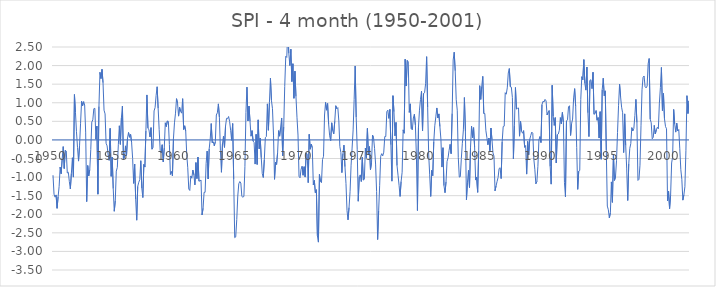
| Category | SPI - 4 month |
|---|---|
| 1950.0 | -0.95 |
| nan | -1.46 |
| nan | -1.54 |
| nan | -1.48 |
| nan | -1.84 |
| nan | -1.53 |
| nan | -1.25 |
| nan | -0.73 |
| nan | -0.91 |
| nan | -0.51 |
| nan | -0.18 |
| nan | -0.77 |
| nan | -0.28 |
| nan | -0.3 |
| nan | -0.89 |
| nan | -0.87 |
| nan | -1.12 |
| nan | -1.32 |
| nan | -0.9 |
| nan | -0.48 |
| nan | -1 |
| nan | 1.22 |
| nan | 0.74 |
| nan | 0.22 |
| nan | -0.2 |
| nan | -0.57 |
| nan | -0.16 |
| nan | 0.45 |
| nan | 1.04 |
| nan | 0.92 |
| nan | 1.03 |
| nan | 0.94 |
| nan | 0.21 |
| nan | -1.66 |
| nan | -0.69 |
| nan | -0.97 |
| nan | -0.8 |
| nan | -0.26 |
| nan | 0.48 |
| nan | 0.54 |
| nan | 0.84 |
| nan | 0.85 |
| nan | 0.02 |
| nan | 0.37 |
| nan | -1.46 |
| nan | 0.9 |
| nan | 1.82 |
| nan | 1.65 |
| nan | 1.9 |
| nan | 1.54 |
| nan | 0.8 |
| nan | 0.7 |
| nan | -0.09 |
| nan | -0.16 |
| nan | -0.4 |
| nan | -0.55 |
| nan | 0.31 |
| nan | -0.98 |
| nan | -0.46 |
| nan | -1.31 |
| 1955.0 | -1.92 |
| nan | -1.64 |
| nan | -0.84 |
| nan | -0.74 |
| nan | -0.13 |
| nan | 0.38 |
| nan | -0.12 |
| nan | 0.59 |
| nan | 0.91 |
| nan | -0.52 |
| nan | -0.46 |
| nan | -0.16 |
| nan | -0.42 |
| nan | 0.05 |
| nan | 0.2 |
| nan | 0.07 |
| nan | 0.15 |
| nan | -0.07 |
| nan | -0.5 |
| nan | -1.17 |
| nan | -0.65 |
| nan | -1.6 |
| nan | -2.16 |
| nan | -1.25 |
| nan | -1.14 |
| nan | -1.07 |
| nan | -0.56 |
| nan | -1.3 |
| nan | -1.55 |
| nan | -0.66 |
| nan | -0.73 |
| nan | 0.24 |
| nan | 1.21 |
| nan | 0.32 |
| nan | 0.27 |
| nan | 0.08 |
| nan | 0.33 |
| nan | -0.25 |
| nan | -0.2 |
| nan | 0.78 |
| nan | 0.87 |
| nan | 1.19 |
| nan | 1.43 |
| nan | 0.85 |
| nan | 0.28 |
| nan | -0.28 |
| nan | -0.35 |
| nan | -0.13 |
| nan | -0.59 |
| nan | -0.22 |
| nan | 0.46 |
| nan | 0.36 |
| nan | 0.51 |
| nan | 0.5 |
| nan | -0.12 |
| nan | -0.93 |
| nan | -0.85 |
| nan | -0.97 |
| nan | 0.04 |
| nan | 0.46 |
| 1960.0 | 0.72 |
| nan | 1.11 |
| nan | 0.99 |
| nan | 0.64 |
| nan | 0.88 |
| nan | 0.77 |
| nan | 0.72 |
| nan | 1.11 |
| nan | 0.28 |
| nan | 0.38 |
| nan | 0.24 |
| nan | -0.39 |
| nan | -0.75 |
| nan | -1.32 |
| nan | -1.36 |
| nan | -0.97 |
| nan | -1.03 |
| nan | -0.81 |
| nan | -0.94 |
| nan | -1.21 |
| nan | -0.61 |
| nan | -1.04 |
| nan | -0.46 |
| nan | -1.11 |
| nan | -1.1 |
| nan | -1.08 |
| nan | -2.02 |
| nan | -1.84 |
| nan | -1.41 |
| nan | -1.41 |
| nan | -0.63 |
| nan | -0.3 |
| nan | -1.05 |
| nan | -0.24 |
| nan | 0.02 |
| nan | 0.44 |
| nan | -0.08 |
| nan | -0.05 |
| nan | -0.16 |
| nan | -0.05 |
| nan | 0.67 |
| nan | 0.73 |
| nan | 0.97 |
| nan | 0.61 |
| nan | -0.28 |
| nan | -0.87 |
| nan | -0.11 |
| nan | 0.1 |
| nan | -0.2 |
| nan | 0.37 |
| nan | 0.58 |
| nan | 0.57 |
| nan | 0.63 |
| nan | 0.5 |
| nan | 0.26 |
| nan | -0.01 |
| nan | 0.44 |
| nan | -1.05 |
| nan | -2.63 |
| nan | -2.61 |
| 1965.0 | -2.14 |
| nan | -1.51 |
| nan | -1.18 |
| nan | -1.12 |
| nan | -1.16 |
| nan | -1.52 |
| nan | -1.54 |
| nan | -1.52 |
| nan | -0.72 |
| nan | 0.74 |
| nan | 1.42 |
| nan | 0.51 |
| nan | 0.91 |
| nan | 0.5 |
| nan | 0.1 |
| nan | 0.25 |
| nan | -0.03 |
| nan | -0.07 |
| nan | -0.65 |
| nan | 0.15 |
| nan | -0.66 |
| nan | 0.54 |
| nan | -0.24 |
| nan | 0.05 |
| nan | -0.48 |
| nan | -0.91 |
| nan | -1.01 |
| nan | -0.53 |
| nan | 0.06 |
| nan | 0.09 |
| nan | 0.97 |
| nan | 0.26 |
| nan | 1 |
| nan | 1.66 |
| nan | 1.06 |
| nan | 0.84 |
| nan | 0.13 |
| nan | -1.06 |
| nan | -0.6 |
| nan | -0.66 |
| nan | -0.35 |
| nan | 0.25 |
| nan | 0.1 |
| nan | 0.34 |
| nan | 0.59 |
| nan | -0.43 |
| nan | 0.35 |
| nan | 1.44 |
| nan | 2.25 |
| nan | 2.22 |
| nan | 2.95 |
| nan | 2.33 |
| nan | 2 |
| nan | 2.44 |
| nan | 1.57 |
| nan | 2.05 |
| nan | 1.12 |
| nan | 1.85 |
| nan | 1.17 |
| nan | 0.61 |
| 1970.0 | 0.13 |
| nan | -0.98 |
| nan | -1.02 |
| nan | -0.79 |
| nan | -0.71 |
| nan | -0.95 |
| nan | -0.72 |
| nan | -1 |
| nan | -0.35 |
| nan | -0.38 |
| nan | -1.15 |
| nan | 0.15 |
| nan | -0.25 |
| nan | -0.11 |
| nan | -0.21 |
| nan | -1.21 |
| nan | -1.09 |
| nan | -1.42 |
| nan | -1.34 |
| nan | -2.58 |
| nan | -2.75 |
| nan | -0.93 |
| nan | -1.12 |
| nan | -1.15 |
| nan | -0.53 |
| nan | -0.44 |
| nan | 0.67 |
| nan | 1.01 |
| nan | 0.8 |
| nan | 0.98 |
| nan | 0.43 |
| nan | 0.11 |
| nan | -0.02 |
| nan | 0.46 |
| nan | 0.25 |
| nan | 0.16 |
| nan | 0.5 |
| nan | 0.92 |
| nan | 0.84 |
| nan | 0.87 |
| nan | 0.51 |
| nan | -0.18 |
| nan | -0.34 |
| nan | -0.88 |
| nan | -0.37 |
| nan | -0.14 |
| nan | -0.72 |
| nan | -1.17 |
| nan | -1.9 |
| nan | -2.15 |
| nan | -1.82 |
| nan | -1.39 |
| nan | -0.68 |
| nan | -0.22 |
| nan | 0.27 |
| nan | 1.09 |
| nan | 1.99 |
| nan | 0.61 |
| nan | -0.25 |
| nan | -1.65 |
| 1975.0 | -0.99 |
| nan | -0.94 |
| nan | -1.12 |
| nan | -0.47 |
| nan | -1.08 |
| nan | -1.06 |
| nan | -0.22 |
| nan | -0.48 |
| nan | 0.31 |
| nan | -0.39 |
| nan | -0.18 |
| nan | -0.8 |
| nan | -0.62 |
| nan | 0.13 |
| nan | 0.06 |
| nan | -0.23 |
| nan | -0.65 |
| nan | -1.39 |
| nan | -2.68 |
| nan | -1.91 |
| nan | -1.22 |
| nan | -0.44 |
| nan | -0.37 |
| nan | -0.43 |
| nan | -0.33 |
| nan | 0.09 |
| nan | 0.09 |
| nan | 0.76 |
| nan | 0.8 |
| nan | 0.58 |
| nan | 0.82 |
| nan | -0.13 |
| nan | -1.11 |
| nan | 1.19 |
| nan | 0.76 |
| nan | 0.11 |
| nan | 0.47 |
| nan | -0.69 |
| nan | -0.95 |
| nan | -1.22 |
| nan | -1.52 |
| nan | -1.12 |
| nan | -0.87 |
| nan | 0.27 |
| nan | 0.18 |
| nan | 2.17 |
| nan | 1.45 |
| nan | 2.14 |
| nan | 2.1 |
| nan | 0.74 |
| nan | 0.97 |
| nan | 0.3 |
| nan | 0.27 |
| nan | 0.59 |
| nan | 0.69 |
| nan | 0.4 |
| nan | -0.45 |
| nan | -1.9 |
| nan | 0.34 |
| nan | 0.8 |
| 1980.0 | 1.09 |
| nan | 1.31 |
| nan | 0.24 |
| nan | 1.25 |
| nan | 1.27 |
| nan | 1.51 |
| nan | 2.24 |
| nan | 0.88 |
| nan | -0.38 |
| nan | -0.94 |
| nan | -1.52 |
| nan | -0.82 |
| nan | -0.96 |
| nan | -0.05 |
| nan | 0.38 |
| nan | 0.62 |
| nan | 0.86 |
| nan | 0.59 |
| nan | 0.7 |
| nan | 0.36 |
| nan | 0.02 |
| nan | -0.73 |
| nan | -0.21 |
| nan | -1.23 |
| nan | -1.42 |
| nan | -1.13 |
| nan | -0.58 |
| nan | -0.48 |
| nan | -0.28 |
| nan | -0.12 |
| nan | -0.37 |
| nan | 0.71 |
| nan | 2.15 |
| nan | 2.36 |
| nan | 1.86 |
| nan | 1.08 |
| nan | 0.8 |
| nan | -0.47 |
| nan | -1 |
| nan | -0.99 |
| nan | -0.5 |
| nan | -0.09 |
| nan | 0.27 |
| nan | 1.14 |
| nan | 0.24 |
| nan | -1.61 |
| nan | -1.14 |
| nan | -0.82 |
| nan | -1.28 |
| nan | -0.2 |
| nan | 0.37 |
| nan | 0.06 |
| nan | 0.33 |
| nan | -0.19 |
| nan | -1.08 |
| nan | -1 |
| nan | -1.41 |
| nan | -0.29 |
| nan | 1.46 |
| nan | 1.09 |
| 1985.0 | 1.44 |
| nan | 1.71 |
| nan | 0.71 |
| nan | 0.71 |
| nan | 0.26 |
| nan | 0.07 |
| nan | -0.13 |
| nan | 0.05 |
| nan | -0.29 |
| nan | 0.32 |
| nan | 0.01 |
| nan | -0.35 |
| nan | -0.44 |
| nan | -1.37 |
| nan | -1.24 |
| nan | -1.12 |
| nan | -1.01 |
| nan | -0.77 |
| nan | -0.75 |
| nan | -1.04 |
| nan | -0.05 |
| nan | 0.36 |
| nan | 0.37 |
| nan | 1.27 |
| nan | 1.23 |
| nan | 1.4 |
| nan | 1.8 |
| nan | 1.92 |
| nan | 1.43 |
| nan | 1.42 |
| nan | 1.14 |
| nan | -0.51 |
| nan | 0.39 |
| nan | 1.41 |
| nan | 0.83 |
| nan | 0.85 |
| nan | 0.86 |
| nan | 0.1 |
| nan | 0.5 |
| nan | 0.23 |
| nan | 0.18 |
| nan | 0.25 |
| nan | -0.2 |
| nan | -0.15 |
| nan | -0.92 |
| nan | -0.04 |
| nan | -0.4 |
| nan | 0.01 |
| nan | 0.12 |
| nan | 0.21 |
| nan | 0.18 |
| nan | -0.51 |
| nan | -0.79 |
| nan | -1.18 |
| nan | -1.12 |
| nan | -0.71 |
| nan | 0 |
| nan | 0.09 |
| nan | -0.07 |
| nan | 0.95 |
| 1990.0 | 1.04 |
| nan | 1.02 |
| nan | 1.09 |
| nan | 1.05 |
| nan | 0.67 |
| nan | 0.74 |
| nan | 0.79 |
| nan | -0.71 |
| nan | -1.19 |
| nan | 1.47 |
| nan | 0.64 |
| nan | 0.39 |
| nan | 0.6 |
| nan | -0.62 |
| nan | 0.14 |
| nan | 0.16 |
| nan | 0.26 |
| nan | 0.6 |
| nan | 0.43 |
| nan | 0.74 |
| nan | 0.47 |
| nan | -1.14 |
| nan | -1.53 |
| nan | 0.51 |
| nan | 0.54 |
| nan | 0.89 |
| nan | 0.92 |
| nan | 0.12 |
| nan | 0.44 |
| nan | 0.56 |
| nan | 1.13 |
| nan | 1.38 |
| nan | 0.9 |
| nan | -0.2 |
| nan | -1.33 |
| nan | -0.84 |
| nan | -0.82 |
| nan | 1.09 |
| nan | 1.7 |
| nan | 1.62 |
| nan | 2.16 |
| nan | 1.52 |
| nan | 1.34 |
| nan | 1.96 |
| nan | 0.73 |
| nan | 0.09 |
| nan | 1.6 |
| nan | 1.62 |
| nan | 1.38 |
| nan | 1.82 |
| nan | 0.69 |
| nan | 0.71 |
| nan | 0.79 |
| nan | 0.53 |
| nan | 0.6 |
| nan | 0.05 |
| nan | 0.76 |
| nan | -0.52 |
| nan | 1.35 |
| nan | 1.66 |
| 1995.0 | 1.19 |
| nan | 1.32 |
| nan | -0.27 |
| nan | -1.78 |
| nan | -1.88 |
| nan | -2.1 |
| nan | -1.96 |
| nan | -1.13 |
| nan | -1.68 |
| nan | -0.38 |
| nan | -1.09 |
| nan | -1 |
| nan | -0.56 |
| nan | 0.2 |
| nan | 0.92 |
| nan | 1.5 |
| nan | 1.16 |
| nan | 0.88 |
| nan | 0.73 |
| nan | -0.34 |
| nan | 0.7 |
| nan | -0.15 |
| nan | -0.78 |
| nan | -1.63 |
| nan | -0.64 |
| nan | -0.23 |
| nan | -0.1 |
| nan | 0.33 |
| nan | 0.24 |
| nan | 0.31 |
| nan | 0.66 |
| nan | 1.09 |
| nan | 0.47 |
| nan | -1.09 |
| nan | -1.06 |
| nan | -0.68 |
| nan | 0.38 |
| nan | 1.35 |
| nan | 1.68 |
| nan | 1.72 |
| nan | 1.43 |
| nan | 1.4 |
| nan | 1.45 |
| nan | 2.05 |
| nan | 2.19 |
| nan | 0.56 |
| nan | 0.46 |
| nan | 0.03 |
| nan | 0.07 |
| nan | 0.39 |
| nan | 0.16 |
| nan | 0.27 |
| nan | 0.34 |
| nan | 0.3 |
| nan | 0.99 |
| nan | 1.41 |
| nan | 1.95 |
| nan | 0.79 |
| nan | 1.25 |
| nan | 0.57 |
| 2000.0 | 0.36 |
| nan | 0.3 |
| nan | -1.64 |
| nan | -1.38 |
| nan | -1.85 |
| nan | -1.49 |
| nan | -0.62 |
| nan | -0.45 |
| nan | 0.82 |
| nan | 0.43 |
| nan | 0.21 |
| nan | 0.45 |
| nan | 0.24 |
| nan | 0.28 |
| nan | -0.24 |
| nan | -0.8 |
| nan | -1.06 |
| nan | -1.62 |
| nan | -1.48 |
| nan | -1.26 |
| nan | -0.29 |
| nan | 1.19 |
| nan | 0.71 |
| nan | 1.05 |
| nan | 0.97 |